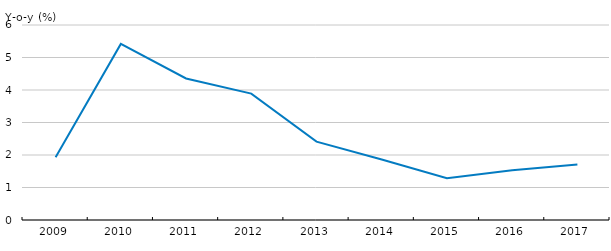
| Category | Series 0 |
|---|---|
| 2009.0 | 1.934 |
| 2010.0 | 5.418 |
| 2011.0 | 4.355 |
| 2012.0 | 3.889 |
| 2013.0 | 2.41 |
| 2014.0 | 1.863 |
| 2015.0 | 1.285 |
| 2016.0 | 1.528 |
| 2017.0 | 1.707 |